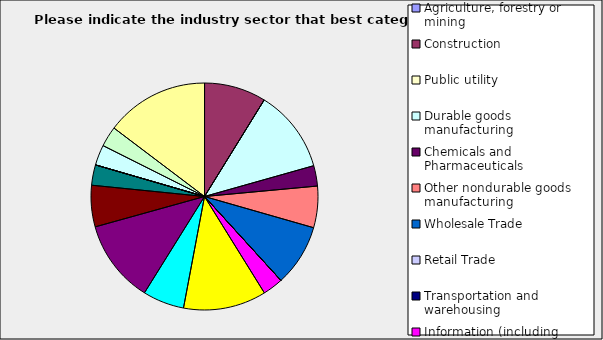
| Category | Series 0 |
|---|---|
| Agriculture, forestry or mining | 0 |
| Construction | 0.088 |
| Public utility | 0 |
| Durable goods manufacturing | 0.118 |
| Chemicals and Pharmaceuticals | 0.029 |
| Other nondurable goods manufacturing | 0.059 |
| Wholesale Trade | 0.088 |
| Retail Trade | 0 |
| Transportation and warehousing | 0 |
| Information (including broadcasting and telecommunication) | 0.029 |
| Finance and Insurance | 0.118 |
| Real Estate | 0.059 |
| Professional, scientific and technical services | 0.118 |
| Consulting | 0.059 |
| Administrative and office services (including waste management) | 0.029 |
| Education | 0 |
| Health Care and social services | 0 |
| Arts, entertainment and recreation | 0.029 |
| Accommodation and food services | 0.029 |
| Other | 0.147 |